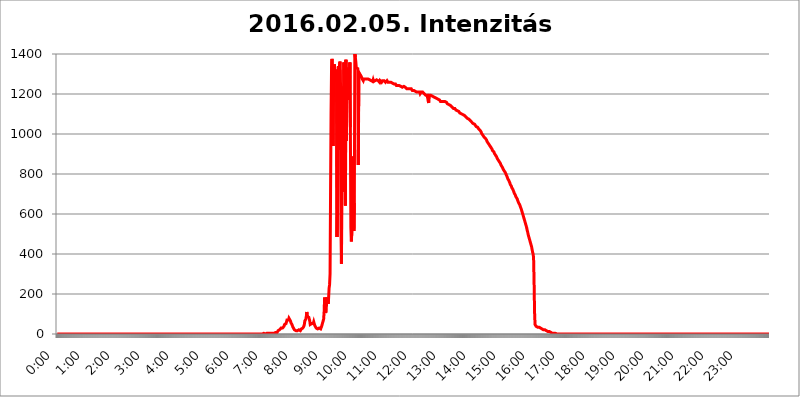
| Category | 2016.02.05. Intenzitás [W/m^2] |
|---|---|
| 0.0 | 0 |
| 0.0006944444444444445 | 0 |
| 0.001388888888888889 | 0 |
| 0.0020833333333333333 | 0 |
| 0.002777777777777778 | 0 |
| 0.003472222222222222 | 0 |
| 0.004166666666666667 | 0 |
| 0.004861111111111111 | 0 |
| 0.005555555555555556 | 0 |
| 0.0062499999999999995 | 0 |
| 0.006944444444444444 | 0 |
| 0.007638888888888889 | 0 |
| 0.008333333333333333 | 0 |
| 0.009027777777777779 | 0 |
| 0.009722222222222222 | 0 |
| 0.010416666666666666 | 0 |
| 0.011111111111111112 | 0 |
| 0.011805555555555555 | 0 |
| 0.012499999999999999 | 0 |
| 0.013194444444444444 | 0 |
| 0.013888888888888888 | 0 |
| 0.014583333333333332 | 0 |
| 0.015277777777777777 | 0 |
| 0.015972222222222224 | 0 |
| 0.016666666666666666 | 0 |
| 0.017361111111111112 | 0 |
| 0.018055555555555557 | 0 |
| 0.01875 | 0 |
| 0.019444444444444445 | 0 |
| 0.02013888888888889 | 0 |
| 0.020833333333333332 | 0 |
| 0.02152777777777778 | 0 |
| 0.022222222222222223 | 0 |
| 0.02291666666666667 | 0 |
| 0.02361111111111111 | 0 |
| 0.024305555555555556 | 0 |
| 0.024999999999999998 | 0 |
| 0.025694444444444447 | 0 |
| 0.02638888888888889 | 0 |
| 0.027083333333333334 | 0 |
| 0.027777777777777776 | 0 |
| 0.02847222222222222 | 0 |
| 0.029166666666666664 | 0 |
| 0.029861111111111113 | 0 |
| 0.030555555555555555 | 0 |
| 0.03125 | 0 |
| 0.03194444444444445 | 0 |
| 0.03263888888888889 | 0 |
| 0.03333333333333333 | 0 |
| 0.034027777777777775 | 0 |
| 0.034722222222222224 | 0 |
| 0.035416666666666666 | 0 |
| 0.036111111111111115 | 0 |
| 0.03680555555555556 | 0 |
| 0.0375 | 0 |
| 0.03819444444444444 | 0 |
| 0.03888888888888889 | 0 |
| 0.03958333333333333 | 0 |
| 0.04027777777777778 | 0 |
| 0.04097222222222222 | 0 |
| 0.041666666666666664 | 0 |
| 0.042361111111111106 | 0 |
| 0.04305555555555556 | 0 |
| 0.043750000000000004 | 0 |
| 0.044444444444444446 | 0 |
| 0.04513888888888889 | 0 |
| 0.04583333333333334 | 0 |
| 0.04652777777777778 | 0 |
| 0.04722222222222222 | 0 |
| 0.04791666666666666 | 0 |
| 0.04861111111111111 | 0 |
| 0.049305555555555554 | 0 |
| 0.049999999999999996 | 0 |
| 0.05069444444444445 | 0 |
| 0.051388888888888894 | 0 |
| 0.052083333333333336 | 0 |
| 0.05277777777777778 | 0 |
| 0.05347222222222222 | 0 |
| 0.05416666666666667 | 0 |
| 0.05486111111111111 | 0 |
| 0.05555555555555555 | 0 |
| 0.05625 | 0 |
| 0.05694444444444444 | 0 |
| 0.057638888888888885 | 0 |
| 0.05833333333333333 | 0 |
| 0.05902777777777778 | 0 |
| 0.059722222222222225 | 0 |
| 0.06041666666666667 | 0 |
| 0.061111111111111116 | 0 |
| 0.06180555555555556 | 0 |
| 0.0625 | 0 |
| 0.06319444444444444 | 0 |
| 0.06388888888888888 | 0 |
| 0.06458333333333334 | 0 |
| 0.06527777777777778 | 0 |
| 0.06597222222222222 | 0 |
| 0.06666666666666667 | 0 |
| 0.06736111111111111 | 0 |
| 0.06805555555555555 | 0 |
| 0.06874999999999999 | 0 |
| 0.06944444444444443 | 0 |
| 0.07013888888888889 | 0 |
| 0.07083333333333333 | 0 |
| 0.07152777777777779 | 0 |
| 0.07222222222222223 | 0 |
| 0.07291666666666667 | 0 |
| 0.07361111111111111 | 0 |
| 0.07430555555555556 | 0 |
| 0.075 | 0 |
| 0.07569444444444444 | 0 |
| 0.0763888888888889 | 0 |
| 0.07708333333333334 | 0 |
| 0.07777777777777778 | 0 |
| 0.07847222222222222 | 0 |
| 0.07916666666666666 | 0 |
| 0.0798611111111111 | 0 |
| 0.08055555555555556 | 0 |
| 0.08125 | 0 |
| 0.08194444444444444 | 0 |
| 0.08263888888888889 | 0 |
| 0.08333333333333333 | 0 |
| 0.08402777777777777 | 0 |
| 0.08472222222222221 | 0 |
| 0.08541666666666665 | 0 |
| 0.08611111111111112 | 0 |
| 0.08680555555555557 | 0 |
| 0.08750000000000001 | 0 |
| 0.08819444444444445 | 0 |
| 0.08888888888888889 | 0 |
| 0.08958333333333333 | 0 |
| 0.09027777777777778 | 0 |
| 0.09097222222222222 | 0 |
| 0.09166666666666667 | 0 |
| 0.09236111111111112 | 0 |
| 0.09305555555555556 | 0 |
| 0.09375 | 0 |
| 0.09444444444444444 | 0 |
| 0.09513888888888888 | 0 |
| 0.09583333333333333 | 0 |
| 0.09652777777777777 | 0 |
| 0.09722222222222222 | 0 |
| 0.09791666666666667 | 0 |
| 0.09861111111111111 | 0 |
| 0.09930555555555555 | 0 |
| 0.09999999999999999 | 0 |
| 0.10069444444444443 | 0 |
| 0.1013888888888889 | 0 |
| 0.10208333333333335 | 0 |
| 0.10277777777777779 | 0 |
| 0.10347222222222223 | 0 |
| 0.10416666666666667 | 0 |
| 0.10486111111111111 | 0 |
| 0.10555555555555556 | 0 |
| 0.10625 | 0 |
| 0.10694444444444444 | 0 |
| 0.1076388888888889 | 0 |
| 0.10833333333333334 | 0 |
| 0.10902777777777778 | 0 |
| 0.10972222222222222 | 0 |
| 0.1111111111111111 | 0 |
| 0.11180555555555556 | 0 |
| 0.11180555555555556 | 0 |
| 0.1125 | 0 |
| 0.11319444444444444 | 0 |
| 0.11388888888888889 | 0 |
| 0.11458333333333333 | 0 |
| 0.11527777777777777 | 0 |
| 0.11597222222222221 | 0 |
| 0.11666666666666665 | 0 |
| 0.1173611111111111 | 0 |
| 0.11805555555555557 | 0 |
| 0.11944444444444445 | 0 |
| 0.12013888888888889 | 0 |
| 0.12083333333333333 | 0 |
| 0.12152777777777778 | 0 |
| 0.12222222222222223 | 0 |
| 0.12291666666666667 | 0 |
| 0.12291666666666667 | 0 |
| 0.12361111111111112 | 0 |
| 0.12430555555555556 | 0 |
| 0.125 | 0 |
| 0.12569444444444444 | 0 |
| 0.12638888888888888 | 0 |
| 0.12708333333333333 | 0 |
| 0.16875 | 0 |
| 0.12847222222222224 | 0 |
| 0.12916666666666668 | 0 |
| 0.12986111111111112 | 0 |
| 0.13055555555555556 | 0 |
| 0.13125 | 0 |
| 0.13194444444444445 | 0 |
| 0.1326388888888889 | 0 |
| 0.13333333333333333 | 0 |
| 0.13402777777777777 | 0 |
| 0.13402777777777777 | 0 |
| 0.13472222222222222 | 0 |
| 0.13541666666666666 | 0 |
| 0.1361111111111111 | 0 |
| 0.13749999999999998 | 0 |
| 0.13819444444444443 | 0 |
| 0.1388888888888889 | 0 |
| 0.13958333333333334 | 0 |
| 0.14027777777777778 | 0 |
| 0.14097222222222222 | 0 |
| 0.14166666666666666 | 0 |
| 0.1423611111111111 | 0 |
| 0.14305555555555557 | 0 |
| 0.14375000000000002 | 0 |
| 0.14444444444444446 | 0 |
| 0.1451388888888889 | 0 |
| 0.1451388888888889 | 0 |
| 0.14652777777777778 | 0 |
| 0.14722222222222223 | 0 |
| 0.14791666666666667 | 0 |
| 0.1486111111111111 | 0 |
| 0.14930555555555555 | 0 |
| 0.15 | 0 |
| 0.15069444444444444 | 0 |
| 0.15138888888888888 | 0 |
| 0.15208333333333332 | 0 |
| 0.15277777777777776 | 0 |
| 0.15347222222222223 | 0 |
| 0.15416666666666667 | 0 |
| 0.15486111111111112 | 0 |
| 0.15555555555555556 | 0 |
| 0.15625 | 0 |
| 0.15694444444444444 | 0 |
| 0.15763888888888888 | 0 |
| 0.15833333333333333 | 0 |
| 0.15902777777777777 | 0 |
| 0.15972222222222224 | 0 |
| 0.16041666666666668 | 0 |
| 0.16111111111111112 | 0 |
| 0.16180555555555556 | 0 |
| 0.1625 | 0 |
| 0.16319444444444445 | 0 |
| 0.1638888888888889 | 0 |
| 0.16458333333333333 | 0 |
| 0.16527777777777777 | 0 |
| 0.16597222222222222 | 0 |
| 0.16666666666666666 | 0 |
| 0.1673611111111111 | 0 |
| 0.16805555555555554 | 0 |
| 0.16874999999999998 | 0 |
| 0.16944444444444443 | 0 |
| 0.17013888888888887 | 0 |
| 0.1708333333333333 | 0 |
| 0.17152777777777775 | 0 |
| 0.17222222222222225 | 0 |
| 0.1729166666666667 | 0 |
| 0.17361111111111113 | 0 |
| 0.17430555555555557 | 0 |
| 0.17500000000000002 | 0 |
| 0.17569444444444446 | 0 |
| 0.1763888888888889 | 0 |
| 0.17708333333333334 | 0 |
| 0.17777777777777778 | 0 |
| 0.17847222222222223 | 0 |
| 0.17916666666666667 | 0 |
| 0.1798611111111111 | 0 |
| 0.18055555555555555 | 0 |
| 0.18125 | 0 |
| 0.18194444444444444 | 0 |
| 0.1826388888888889 | 0 |
| 0.18333333333333335 | 0 |
| 0.1840277777777778 | 0 |
| 0.18472222222222223 | 0 |
| 0.18541666666666667 | 0 |
| 0.18611111111111112 | 0 |
| 0.18680555555555556 | 0 |
| 0.1875 | 0 |
| 0.18819444444444444 | 0 |
| 0.18888888888888888 | 0 |
| 0.18958333333333333 | 0 |
| 0.19027777777777777 | 0 |
| 0.1909722222222222 | 0 |
| 0.19166666666666665 | 0 |
| 0.19236111111111112 | 0 |
| 0.19305555555555554 | 0 |
| 0.19375 | 0 |
| 0.19444444444444445 | 0 |
| 0.1951388888888889 | 0 |
| 0.19583333333333333 | 0 |
| 0.19652777777777777 | 0 |
| 0.19722222222222222 | 0 |
| 0.19791666666666666 | 0 |
| 0.1986111111111111 | 0 |
| 0.19930555555555554 | 0 |
| 0.19999999999999998 | 0 |
| 0.20069444444444443 | 0 |
| 0.20138888888888887 | 0 |
| 0.2020833333333333 | 0 |
| 0.2027777777777778 | 0 |
| 0.2034722222222222 | 0 |
| 0.2041666666666667 | 0 |
| 0.20486111111111113 | 0 |
| 0.20555555555555557 | 0 |
| 0.20625000000000002 | 0 |
| 0.20694444444444446 | 0 |
| 0.2076388888888889 | 0 |
| 0.20833333333333334 | 0 |
| 0.20902777777777778 | 0 |
| 0.20972222222222223 | 0 |
| 0.21041666666666667 | 0 |
| 0.2111111111111111 | 0 |
| 0.21180555555555555 | 0 |
| 0.2125 | 0 |
| 0.21319444444444444 | 0 |
| 0.2138888888888889 | 0 |
| 0.21458333333333335 | 0 |
| 0.2152777777777778 | 0 |
| 0.21597222222222223 | 0 |
| 0.21666666666666667 | 0 |
| 0.21736111111111112 | 0 |
| 0.21805555555555556 | 0 |
| 0.21875 | 0 |
| 0.21944444444444444 | 0 |
| 0.22013888888888888 | 0 |
| 0.22083333333333333 | 0 |
| 0.22152777777777777 | 0 |
| 0.2222222222222222 | 0 |
| 0.22291666666666665 | 0 |
| 0.2236111111111111 | 0 |
| 0.22430555555555556 | 0 |
| 0.225 | 0 |
| 0.22569444444444445 | 0 |
| 0.2263888888888889 | 0 |
| 0.22708333333333333 | 0 |
| 0.22777777777777777 | 0 |
| 0.22847222222222222 | 0 |
| 0.22916666666666666 | 0 |
| 0.2298611111111111 | 0 |
| 0.23055555555555554 | 0 |
| 0.23124999999999998 | 0 |
| 0.23194444444444443 | 0 |
| 0.23263888888888887 | 0 |
| 0.2333333333333333 | 0 |
| 0.2340277777777778 | 0 |
| 0.2347222222222222 | 0 |
| 0.2354166666666667 | 0 |
| 0.23611111111111113 | 0 |
| 0.23680555555555557 | 0 |
| 0.23750000000000002 | 0 |
| 0.23819444444444446 | 0 |
| 0.2388888888888889 | 0 |
| 0.23958333333333334 | 0 |
| 0.24027777777777778 | 0 |
| 0.24097222222222223 | 0 |
| 0.24166666666666667 | 0 |
| 0.2423611111111111 | 0 |
| 0.24305555555555555 | 0 |
| 0.24375 | 0 |
| 0.24444444444444446 | 0 |
| 0.24513888888888888 | 0 |
| 0.24583333333333335 | 0 |
| 0.2465277777777778 | 0 |
| 0.24722222222222223 | 0 |
| 0.24791666666666667 | 0 |
| 0.24861111111111112 | 0 |
| 0.24930555555555556 | 0 |
| 0.25 | 0 |
| 0.25069444444444444 | 0 |
| 0.2513888888888889 | 0 |
| 0.2520833333333333 | 0 |
| 0.25277777777777777 | 0 |
| 0.2534722222222222 | 0 |
| 0.25416666666666665 | 0 |
| 0.2548611111111111 | 0 |
| 0.2555555555555556 | 0 |
| 0.25625000000000003 | 0 |
| 0.2569444444444445 | 0 |
| 0.2576388888888889 | 0 |
| 0.25833333333333336 | 0 |
| 0.2590277777777778 | 0 |
| 0.25972222222222224 | 0 |
| 0.2604166666666667 | 0 |
| 0.2611111111111111 | 0 |
| 0.26180555555555557 | 0 |
| 0.2625 | 0 |
| 0.26319444444444445 | 0 |
| 0.2638888888888889 | 0 |
| 0.26458333333333334 | 0 |
| 0.2652777777777778 | 0 |
| 0.2659722222222222 | 0 |
| 0.26666666666666666 | 0 |
| 0.2673611111111111 | 0 |
| 0.26805555555555555 | 0 |
| 0.26875 | 0 |
| 0.26944444444444443 | 0 |
| 0.2701388888888889 | 0 |
| 0.2708333333333333 | 0 |
| 0.27152777777777776 | 0 |
| 0.2722222222222222 | 0 |
| 0.27291666666666664 | 0 |
| 0.2736111111111111 | 0 |
| 0.2743055555555555 | 0 |
| 0.27499999999999997 | 0 |
| 0.27569444444444446 | 0 |
| 0.27638888888888885 | 0 |
| 0.27708333333333335 | 0 |
| 0.2777777777777778 | 0 |
| 0.27847222222222223 | 0 |
| 0.2791666666666667 | 0 |
| 0.2798611111111111 | 0 |
| 0.28055555555555556 | 0 |
| 0.28125 | 0 |
| 0.28194444444444444 | 0 |
| 0.2826388888888889 | 0 |
| 0.2833333333333333 | 0 |
| 0.28402777777777777 | 0 |
| 0.2847222222222222 | 0 |
| 0.28541666666666665 | 0 |
| 0.28611111111111115 | 0 |
| 0.28680555555555554 | 0 |
| 0.28750000000000003 | 0 |
| 0.2881944444444445 | 0 |
| 0.2888888888888889 | 3.525 |
| 0.28958333333333336 | 3.525 |
| 0.2902777777777778 | 3.525 |
| 0.29097222222222224 | 0 |
| 0.2916666666666667 | 0 |
| 0.2923611111111111 | 3.525 |
| 0.29305555555555557 | 3.525 |
| 0.29375 | 3.525 |
| 0.29444444444444445 | 0 |
| 0.2951388888888889 | 3.525 |
| 0.29583333333333334 | 3.525 |
| 0.2965277777777778 | 3.525 |
| 0.2972222222222222 | 3.525 |
| 0.29791666666666666 | 3.525 |
| 0.2986111111111111 | 3.525 |
| 0.29930555555555555 | 3.525 |
| 0.3 | 3.525 |
| 0.30069444444444443 | 3.525 |
| 0.3013888888888889 | 3.525 |
| 0.3020833333333333 | 3.525 |
| 0.30277777777777776 | 3.525 |
| 0.3034722222222222 | 3.525 |
| 0.30416666666666664 | 3.525 |
| 0.3048611111111111 | 7.887 |
| 0.3055555555555555 | 7.887 |
| 0.30624999999999997 | 7.887 |
| 0.3069444444444444 | 7.887 |
| 0.3076388888888889 | 12.257 |
| 0.30833333333333335 | 7.887 |
| 0.3090277777777778 | 12.257 |
| 0.30972222222222223 | 16.636 |
| 0.3104166666666667 | 16.636 |
| 0.3111111111111111 | 21.024 |
| 0.31180555555555556 | 21.024 |
| 0.3125 | 21.024 |
| 0.31319444444444444 | 25.419 |
| 0.3138888888888889 | 29.823 |
| 0.3145833333333333 | 25.419 |
| 0.31527777777777777 | 25.419 |
| 0.3159722222222222 | 29.823 |
| 0.31666666666666665 | 34.234 |
| 0.31736111111111115 | 34.234 |
| 0.31805555555555554 | 38.653 |
| 0.31875000000000003 | 47.511 |
| 0.3194444444444445 | 51.951 |
| 0.3201388888888889 | 51.951 |
| 0.32083333333333336 | 51.951 |
| 0.3215277777777778 | 60.85 |
| 0.32222222222222224 | 69.775 |
| 0.3229166666666667 | 69.775 |
| 0.3236111111111111 | 74.246 |
| 0.32430555555555557 | 69.775 |
| 0.325 | 78.722 |
| 0.32569444444444445 | 74.246 |
| 0.3263888888888889 | 83.205 |
| 0.32708333333333334 | 65.31 |
| 0.3277777777777778 | 56.398 |
| 0.3284722222222222 | 60.85 |
| 0.32916666666666666 | 47.511 |
| 0.3298611111111111 | 43.079 |
| 0.33055555555555555 | 34.234 |
| 0.33125 | 29.823 |
| 0.33194444444444443 | 29.823 |
| 0.3326388888888889 | 21.024 |
| 0.3333333333333333 | 21.024 |
| 0.3340277777777778 | 16.636 |
| 0.3347222222222222 | 16.636 |
| 0.3354166666666667 | 16.636 |
| 0.3361111111111111 | 16.636 |
| 0.3368055555555556 | 16.636 |
| 0.33749999999999997 | 12.257 |
| 0.33819444444444446 | 16.636 |
| 0.33888888888888885 | 21.024 |
| 0.33958333333333335 | 21.024 |
| 0.34027777777777773 | 16.636 |
| 0.34097222222222223 | 16.636 |
| 0.3416666666666666 | 21.024 |
| 0.3423611111111111 | 25.419 |
| 0.3430555555555555 | 25.419 |
| 0.34375 | 29.823 |
| 0.3444444444444445 | 29.823 |
| 0.3451388888888889 | 34.234 |
| 0.3458333333333334 | 38.653 |
| 0.34652777777777777 | 47.511 |
| 0.34722222222222227 | 65.31 |
| 0.34791666666666665 | 65.31 |
| 0.34861111111111115 | 74.246 |
| 0.34930555555555554 | 87.692 |
| 0.35000000000000003 | 110.201 |
| 0.3506944444444444 | 87.692 |
| 0.3513888888888889 | 87.692 |
| 0.3520833333333333 | 87.692 |
| 0.3527777777777778 | 83.205 |
| 0.3534722222222222 | 78.722 |
| 0.3541666666666667 | 65.31 |
| 0.3548611111111111 | 47.511 |
| 0.35555555555555557 | 47.511 |
| 0.35625 | 47.511 |
| 0.35694444444444445 | 51.951 |
| 0.3576388888888889 | 47.511 |
| 0.35833333333333334 | 47.511 |
| 0.3590277777777778 | 51.951 |
| 0.3597222222222222 | 60.85 |
| 0.36041666666666666 | 56.398 |
| 0.3611111111111111 | 43.079 |
| 0.36180555555555555 | 43.079 |
| 0.3625 | 38.653 |
| 0.36319444444444443 | 29.823 |
| 0.3638888888888889 | 29.823 |
| 0.3645833333333333 | 29.823 |
| 0.3652777777777778 | 25.419 |
| 0.3659722222222222 | 25.419 |
| 0.3666666666666667 | 29.823 |
| 0.3673611111111111 | 29.823 |
| 0.3680555555555556 | 29.823 |
| 0.36874999999999997 | 29.823 |
| 0.36944444444444446 | 25.419 |
| 0.37013888888888885 | 29.823 |
| 0.37083333333333335 | 38.653 |
| 0.37152777777777773 | 47.511 |
| 0.37222222222222223 | 56.398 |
| 0.3729166666666666 | 56.398 |
| 0.3736111111111111 | 74.246 |
| 0.3743055555555555 | 110.201 |
| 0.375 | 182.82 |
| 0.3756944444444445 | 150.964 |
| 0.3763888888888889 | 105.69 |
| 0.3770833333333334 | 114.716 |
| 0.37777777777777777 | 155.509 |
| 0.37847222222222227 | 173.709 |
| 0.37916666666666665 | 182.82 |
| 0.37986111111111115 | 150.964 |
| 0.38055555555555554 | 178.264 |
| 0.38125000000000003 | 228.436 |
| 0.3819444444444444 | 246.689 |
| 0.3826388888888889 | 301.354 |
| 0.3833333333333333 | 711.832 |
| 0.3840277777777778 | 1105.019 |
| 0.3847222222222222 | 1335.223 |
| 0.3854166666666667 | 1375.633 |
| 0.3861111111111111 | 1375.633 |
| 0.38680555555555557 | 940.082 |
| 0.3875 | 1217.812 |
| 0.38819444444444445 | 1339.639 |
| 0.3888888888888889 | 1348.524 |
| 0.38958333333333334 | 1291.997 |
| 0.3902777777777778 | 1322.082 |
| 0.3909722222222222 | 1258.511 |
| 0.39166666666666666 | 1313.406 |
| 0.3923611111111111 | 484.735 |
| 0.39305555555555555 | 617.436 |
| 0.39375 | 829.981 |
| 0.39444444444444443 | 1339.639 |
| 0.3951388888888889 | 921.298 |
| 0.3958333333333333 | 1339.639 |
| 0.3965277777777778 | 1361.991 |
| 0.3972222222222222 | 1233.951 |
| 0.3979166666666667 | 528.2 |
| 0.3986111111111111 | 351.198 |
| 0.3993055555555556 | 943.832 |
| 0.39999999999999997 | 1238.014 |
| 0.40069444444444446 | 1059.756 |
| 0.40138888888888885 | 711.832 |
| 0.40208333333333335 | 1357.483 |
| 0.40277777777777773 | 1071.027 |
| 0.40347222222222223 | 1262.649 |
| 0.4041666666666666 | 642.4 |
| 0.4048611111111111 | 1371.066 |
| 0.4055555555555555 | 966.295 |
| 0.40625 | 1330.826 |
| 0.4069444444444445 | 1335.223 |
| 0.4076388888888889 | 1283.541 |
| 0.4083333333333334 | 1330.826 |
| 0.40902777777777777 | 1300.514 |
| 0.40972222222222227 | 1170.358 |
| 0.41041666666666665 | 1357.483 |
| 0.41111111111111115 | 1033.537 |
| 0.41180555555555554 | 532.513 |
| 0.41250000000000003 | 462.786 |
| 0.4131944444444444 | 515.223 |
| 0.4138888888888889 | 523.88 |
| 0.4145833333333333 | 667.123 |
| 0.4152777777777778 | 887.309 |
| 0.4159722222222222 | 515.223 |
| 0.4166666666666667 | 654.791 |
| 0.4173611111111111 | 1408.184 |
| 0.41805555555555557 | 1384.828 |
| 0.41875 | 1361.991 |
| 0.41944444444444445 | 1330.826 |
| 0.4201388888888889 | 1330.826 |
| 0.42083333333333334 | 1335.223 |
| 0.4215277777777778 | 1326.445 |
| 0.4222222222222222 | 845.365 |
| 0.42291666666666666 | 1275.142 |
| 0.4236111111111111 | 1304.795 |
| 0.42430555555555555 | 1300.514 |
| 0.425 | 1296.248 |
| 0.42569444444444443 | 1291.997 |
| 0.4263888888888889 | 1287.761 |
| 0.4270833333333333 | 1287.761 |
| 0.4277777777777778 | 1275.142 |
| 0.4284722222222222 | 1279.334 |
| 0.4291666666666667 | 1266.8 |
| 0.4298611111111111 | 1275.142 |
| 0.4305555555555556 | 1275.142 |
| 0.43124999999999997 | 1270.964 |
| 0.43194444444444446 | 1275.142 |
| 0.43263888888888885 | 1270.964 |
| 0.43333333333333335 | 1270.964 |
| 0.43402777777777773 | 1275.142 |
| 0.43472222222222223 | 1275.142 |
| 0.4354166666666666 | 1275.142 |
| 0.4361111111111111 | 1275.142 |
| 0.4368055555555555 | 1275.142 |
| 0.4375 | 1275.142 |
| 0.4381944444444445 | 1270.964 |
| 0.4388888888888889 | 1266.8 |
| 0.4395833333333334 | 1266.8 |
| 0.44027777777777777 | 1266.8 |
| 0.44097222222222227 | 1266.8 |
| 0.44166666666666665 | 1266.8 |
| 0.44236111111111115 | 1262.649 |
| 0.44305555555555554 | 1270.964 |
| 0.44375000000000003 | 1262.649 |
| 0.4444444444444444 | 1266.8 |
| 0.4451388888888889 | 1266.8 |
| 0.4458333333333333 | 1266.8 |
| 0.4465277777777778 | 1266.8 |
| 0.4472222222222222 | 1266.8 |
| 0.4479166666666667 | 1270.964 |
| 0.4486111111111111 | 1266.8 |
| 0.44930555555555557 | 1266.8 |
| 0.45 | 1266.8 |
| 0.45069444444444445 | 1266.8 |
| 0.4513888888888889 | 1262.649 |
| 0.45208333333333334 | 1258.511 |
| 0.4527777777777778 | 1266.8 |
| 0.4534722222222222 | 1262.649 |
| 0.45416666666666666 | 1266.8 |
| 0.4548611111111111 | 1258.511 |
| 0.45555555555555555 | 1262.649 |
| 0.45625 | 1266.8 |
| 0.45694444444444443 | 1262.649 |
| 0.4576388888888889 | 1262.649 |
| 0.4583333333333333 | 1266.8 |
| 0.4590277777777778 | 1262.649 |
| 0.4597222222222222 | 1262.649 |
| 0.4604166666666667 | 1258.511 |
| 0.4611111111111111 | 1258.511 |
| 0.4618055555555556 | 1262.649 |
| 0.46249999999999997 | 1266.8 |
| 0.46319444444444446 | 1262.649 |
| 0.46388888888888885 | 1258.511 |
| 0.46458333333333335 | 1258.511 |
| 0.46527777777777773 | 1258.511 |
| 0.46597222222222223 | 1258.511 |
| 0.4666666666666666 | 1262.649 |
| 0.4673611111111111 | 1258.511 |
| 0.4680555555555555 | 1258.511 |
| 0.46875 | 1254.387 |
| 0.4694444444444445 | 1254.387 |
| 0.4701388888888889 | 1254.387 |
| 0.4708333333333334 | 1254.387 |
| 0.47152777777777777 | 1254.387 |
| 0.47222222222222227 | 1250.275 |
| 0.47291666666666665 | 1254.387 |
| 0.47361111111111115 | 1250.275 |
| 0.47430555555555554 | 1250.275 |
| 0.47500000000000003 | 1246.176 |
| 0.4756944444444444 | 1242.089 |
| 0.4763888888888889 | 1246.176 |
| 0.4770833333333333 | 1242.089 |
| 0.4777777777777778 | 1242.089 |
| 0.4784722222222222 | 1242.089 |
| 0.4791666666666667 | 1238.014 |
| 0.4798611111111111 | 1242.089 |
| 0.48055555555555557 | 1242.089 |
| 0.48125 | 1242.089 |
| 0.48194444444444445 | 1238.014 |
| 0.4826388888888889 | 1238.014 |
| 0.48333333333333334 | 1233.951 |
| 0.4840277777777778 | 1233.951 |
| 0.4847222222222222 | 1233.951 |
| 0.48541666666666666 | 1233.951 |
| 0.4861111111111111 | 1238.014 |
| 0.48680555555555555 | 1233.951 |
| 0.4875 | 1233.951 |
| 0.48819444444444443 | 1233.951 |
| 0.4888888888888889 | 1229.899 |
| 0.4895833333333333 | 1229.899 |
| 0.4902777777777778 | 1225.859 |
| 0.4909722222222222 | 1225.859 |
| 0.4916666666666667 | 1229.899 |
| 0.4923611111111111 | 1225.859 |
| 0.4930555555555556 | 1221.83 |
| 0.49374999999999997 | 1221.83 |
| 0.49444444444444446 | 1225.859 |
| 0.49513888888888885 | 1225.859 |
| 0.49583333333333335 | 1221.83 |
| 0.49652777777777773 | 1225.859 |
| 0.49722222222222223 | 1221.83 |
| 0.4979166666666666 | 1217.812 |
| 0.4986111111111111 | 1221.83 |
| 0.4993055555555555 | 1217.812 |
| 0.5 | 1217.812 |
| 0.5006944444444444 | 1217.812 |
| 0.5013888888888889 | 1217.812 |
| 0.5020833333333333 | 1213.804 |
| 0.5027777777777778 | 1209.807 |
| 0.5034722222222222 | 1209.807 |
| 0.5041666666666667 | 1209.807 |
| 0.5048611111111111 | 1209.807 |
| 0.5055555555555555 | 1209.807 |
| 0.50625 | 1209.807 |
| 0.5069444444444444 | 1209.807 |
| 0.5076388888888889 | 1209.807 |
| 0.5083333333333333 | 1209.807 |
| 0.5090277777777777 | 1201.843 |
| 0.5097222222222222 | 1205.82 |
| 0.5104166666666666 | 1209.807 |
| 0.5111111111111112 | 1213.804 |
| 0.5118055555555555 | 1209.807 |
| 0.5125000000000001 | 1209.807 |
| 0.5131944444444444 | 1205.82 |
| 0.513888888888889 | 1205.82 |
| 0.5145833333333333 | 1201.843 |
| 0.5152777777777778 | 1197.876 |
| 0.5159722222222222 | 1197.876 |
| 0.5166666666666667 | 1193.918 |
| 0.517361111111111 | 1193.918 |
| 0.5180555555555556 | 1197.876 |
| 0.5187499999999999 | 1193.918 |
| 0.5194444444444445 | 1197.876 |
| 0.5201388888888888 | 1193.918 |
| 0.5208333333333334 | 1154.814 |
| 0.5215277777777778 | 1193.918 |
| 0.5222222222222223 | 1193.918 |
| 0.5229166666666667 | 1193.918 |
| 0.5236111111111111 | 1193.918 |
| 0.5243055555555556 | 1193.918 |
| 0.525 | 1189.969 |
| 0.5256944444444445 | 1189.969 |
| 0.5263888888888889 | 1189.969 |
| 0.5270833333333333 | 1186.03 |
| 0.5277777777777778 | 1186.03 |
| 0.5284722222222222 | 1186.03 |
| 0.5291666666666667 | 1182.099 |
| 0.5298611111111111 | 1182.099 |
| 0.5305555555555556 | 1182.099 |
| 0.53125 | 1182.099 |
| 0.5319444444444444 | 1178.177 |
| 0.5326388888888889 | 1178.177 |
| 0.5333333333333333 | 1174.263 |
| 0.5340277777777778 | 1174.263 |
| 0.5347222222222222 | 1174.263 |
| 0.5354166666666667 | 1170.358 |
| 0.5361111111111111 | 1170.358 |
| 0.5368055555555555 | 1166.46 |
| 0.5375 | 1162.571 |
| 0.5381944444444444 | 1162.571 |
| 0.5388888888888889 | 1162.571 |
| 0.5395833333333333 | 1162.571 |
| 0.5402777777777777 | 1162.571 |
| 0.5409722222222222 | 1162.571 |
| 0.5416666666666666 | 1162.571 |
| 0.5423611111111112 | 1162.571 |
| 0.5430555555555555 | 1162.571 |
| 0.5437500000000001 | 1162.571 |
| 0.5444444444444444 | 1162.571 |
| 0.545138888888889 | 1158.689 |
| 0.5458333333333333 | 1158.689 |
| 0.5465277777777778 | 1154.814 |
| 0.5472222222222222 | 1150.946 |
| 0.5479166666666667 | 1150.946 |
| 0.548611111111111 | 1147.086 |
| 0.5493055555555556 | 1147.086 |
| 0.5499999999999999 | 1147.086 |
| 0.5506944444444445 | 1143.232 |
| 0.5513888888888888 | 1143.232 |
| 0.5520833333333334 | 1139.384 |
| 0.5527777777777778 | 1139.384 |
| 0.5534722222222223 | 1135.543 |
| 0.5541666666666667 | 1135.543 |
| 0.5548611111111111 | 1131.708 |
| 0.5555555555555556 | 1127.879 |
| 0.55625 | 1127.879 |
| 0.5569444444444445 | 1127.879 |
| 0.5576388888888889 | 1127.879 |
| 0.5583333333333333 | 1124.056 |
| 0.5590277777777778 | 1120.238 |
| 0.5597222222222222 | 1124.056 |
| 0.5604166666666667 | 1116.426 |
| 0.5611111111111111 | 1116.426 |
| 0.5618055555555556 | 1116.426 |
| 0.5625 | 1112.618 |
| 0.5631944444444444 | 1112.618 |
| 0.5638888888888889 | 1108.816 |
| 0.5645833333333333 | 1105.019 |
| 0.5652777777777778 | 1105.019 |
| 0.5659722222222222 | 1101.226 |
| 0.5666666666666667 | 1101.226 |
| 0.5673611111111111 | 1101.226 |
| 0.5680555555555555 | 1097.437 |
| 0.56875 | 1097.437 |
| 0.5694444444444444 | 1093.653 |
| 0.5701388888888889 | 1093.653 |
| 0.5708333333333333 | 1093.653 |
| 0.5715277777777777 | 1093.653 |
| 0.5722222222222222 | 1089.873 |
| 0.5729166666666666 | 1086.097 |
| 0.5736111111111112 | 1086.097 |
| 0.5743055555555555 | 1086.097 |
| 0.5750000000000001 | 1078.555 |
| 0.5756944444444444 | 1078.555 |
| 0.576388888888889 | 1074.789 |
| 0.5770833333333333 | 1074.789 |
| 0.5777777777777778 | 1071.027 |
| 0.5784722222222222 | 1071.027 |
| 0.5791666666666667 | 1067.267 |
| 0.579861111111111 | 1067.267 |
| 0.5805555555555556 | 1063.51 |
| 0.5812499999999999 | 1059.756 |
| 0.5819444444444445 | 1059.756 |
| 0.5826388888888888 | 1056.004 |
| 0.5833333333333334 | 1052.255 |
| 0.5840277777777778 | 1052.255 |
| 0.5847222222222223 | 1048.508 |
| 0.5854166666666667 | 1048.508 |
| 0.5861111111111111 | 1044.762 |
| 0.5868055555555556 | 1044.762 |
| 0.5875 | 1037.277 |
| 0.5881944444444445 | 1037.277 |
| 0.5888888888888889 | 1037.277 |
| 0.5895833333333333 | 1033.537 |
| 0.5902777777777778 | 1029.798 |
| 0.5909722222222222 | 1026.06 |
| 0.5916666666666667 | 1022.323 |
| 0.5923611111111111 | 1022.323 |
| 0.5930555555555556 | 1018.587 |
| 0.59375 | 1014.852 |
| 0.5944444444444444 | 1011.118 |
| 0.5951388888888889 | 1003.65 |
| 0.5958333333333333 | 999.916 |
| 0.5965277777777778 | 996.182 |
| 0.5972222222222222 | 992.448 |
| 0.5979166666666667 | 992.448 |
| 0.5986111111111111 | 984.98 |
| 0.5993055555555555 | 984.98 |
| 0.6 | 981.244 |
| 0.6006944444444444 | 977.508 |
| 0.6013888888888889 | 973.772 |
| 0.6020833333333333 | 970.034 |
| 0.6027777777777777 | 962.555 |
| 0.6034722222222222 | 958.814 |
| 0.6041666666666666 | 955.071 |
| 0.6048611111111112 | 951.327 |
| 0.6055555555555555 | 947.58 |
| 0.6062500000000001 | 943.832 |
| 0.6069444444444444 | 940.082 |
| 0.607638888888889 | 940.082 |
| 0.6083333333333333 | 932.576 |
| 0.6090277777777778 | 928.819 |
| 0.6097222222222222 | 925.06 |
| 0.6104166666666667 | 917.534 |
| 0.611111111111111 | 917.534 |
| 0.6118055555555556 | 913.766 |
| 0.6124999999999999 | 909.996 |
| 0.6131944444444445 | 902.447 |
| 0.6138888888888888 | 898.668 |
| 0.6145833333333334 | 894.885 |
| 0.6152777777777778 | 891.099 |
| 0.6159722222222223 | 887.309 |
| 0.6166666666666667 | 883.516 |
| 0.6173611111111111 | 875.918 |
| 0.6180555555555556 | 872.114 |
| 0.61875 | 868.305 |
| 0.6194444444444445 | 864.493 |
| 0.6201388888888889 | 860.676 |
| 0.6208333333333333 | 856.855 |
| 0.6215277777777778 | 853.029 |
| 0.6222222222222222 | 845.365 |
| 0.6229166666666667 | 845.365 |
| 0.6236111111111111 | 841.526 |
| 0.6243055555555556 | 833.834 |
| 0.625 | 833.834 |
| 0.6256944444444444 | 822.26 |
| 0.6263888888888889 | 822.26 |
| 0.6270833333333333 | 814.519 |
| 0.6277777777777778 | 810.641 |
| 0.6284722222222222 | 806.757 |
| 0.6291666666666667 | 802.868 |
| 0.6298611111111111 | 795.074 |
| 0.6305555555555555 | 791.169 |
| 0.63125 | 783.342 |
| 0.6319444444444444 | 775.492 |
| 0.6326388888888889 | 775.492 |
| 0.6333333333333333 | 767.62 |
| 0.6340277777777777 | 763.674 |
| 0.6347222222222222 | 755.766 |
| 0.6354166666666666 | 747.834 |
| 0.6361111111111112 | 743.859 |
| 0.6368055555555555 | 739.877 |
| 0.6375000000000001 | 731.896 |
| 0.6381944444444444 | 727.896 |
| 0.638888888888889 | 723.889 |
| 0.6395833333333333 | 719.877 |
| 0.6402777777777778 | 711.832 |
| 0.6409722222222222 | 703.762 |
| 0.6416666666666667 | 699.717 |
| 0.642361111111111 | 695.666 |
| 0.6430555555555556 | 687.544 |
| 0.6437499999999999 | 687.544 |
| 0.6444444444444445 | 683.473 |
| 0.6451388888888888 | 675.311 |
| 0.6458333333333334 | 667.123 |
| 0.6465277777777778 | 663.019 |
| 0.6472222222222223 | 654.791 |
| 0.6479166666666667 | 650.667 |
| 0.6486111111111111 | 646.537 |
| 0.6493055555555556 | 638.256 |
| 0.65 | 634.105 |
| 0.6506944444444445 | 625.784 |
| 0.6513888888888889 | 617.436 |
| 0.6520833333333333 | 613.252 |
| 0.6527777777777778 | 600.661 |
| 0.6534722222222222 | 592.233 |
| 0.6541666666666667 | 583.779 |
| 0.6548611111111111 | 575.299 |
| 0.6555555555555556 | 566.793 |
| 0.65625 | 558.261 |
| 0.6569444444444444 | 549.704 |
| 0.6576388888888889 | 541.121 |
| 0.6583333333333333 | 532.513 |
| 0.6590277777777778 | 519.555 |
| 0.6597222222222222 | 510.885 |
| 0.6604166666666667 | 497.836 |
| 0.6611111111111111 | 489.108 |
| 0.6618055555555555 | 480.356 |
| 0.6625 | 471.582 |
| 0.6631944444444444 | 462.786 |
| 0.6638888888888889 | 453.968 |
| 0.6645833333333333 | 445.129 |
| 0.6652777777777777 | 436.27 |
| 0.6659722222222222 | 422.943 |
| 0.6666666666666666 | 409.574 |
| 0.6673611111111111 | 400.638 |
| 0.6680555555555556 | 382.715 |
| 0.6687500000000001 | 264.932 |
| 0.6694444444444444 | 110.201 |
| 0.6701388888888888 | 47.511 |
| 0.6708333333333334 | 43.079 |
| 0.6715277777777778 | 38.653 |
| 0.6722222222222222 | 38.653 |
| 0.6729166666666666 | 38.653 |
| 0.6736111111111112 | 34.234 |
| 0.6743055555555556 | 38.653 |
| 0.6749999999999999 | 34.234 |
| 0.6756944444444444 | 34.234 |
| 0.6763888888888889 | 34.234 |
| 0.6770833333333334 | 29.823 |
| 0.6777777777777777 | 29.823 |
| 0.6784722222222223 | 29.823 |
| 0.6791666666666667 | 25.419 |
| 0.6798611111111111 | 25.419 |
| 0.6805555555555555 | 21.024 |
| 0.68125 | 21.024 |
| 0.6819444444444445 | 21.024 |
| 0.6826388888888889 | 21.024 |
| 0.6833333333333332 | 21.024 |
| 0.6840277777777778 | 21.024 |
| 0.6847222222222222 | 21.024 |
| 0.6854166666666667 | 16.636 |
| 0.686111111111111 | 16.636 |
| 0.6868055555555556 | 16.636 |
| 0.6875 | 16.636 |
| 0.6881944444444444 | 12.257 |
| 0.688888888888889 | 12.257 |
| 0.6895833333333333 | 12.257 |
| 0.6902777777777778 | 12.257 |
| 0.6909722222222222 | 7.887 |
| 0.6916666666666668 | 7.887 |
| 0.6923611111111111 | 7.887 |
| 0.6930555555555555 | 7.887 |
| 0.69375 | 7.887 |
| 0.6944444444444445 | 3.525 |
| 0.6951388888888889 | 3.525 |
| 0.6958333333333333 | 3.525 |
| 0.6965277777777777 | 3.525 |
| 0.6972222222222223 | 3.525 |
| 0.6979166666666666 | 3.525 |
| 0.6986111111111111 | 3.525 |
| 0.6993055555555556 | 0 |
| 0.7000000000000001 | 0 |
| 0.7006944444444444 | 0 |
| 0.7013888888888888 | 0 |
| 0.7020833333333334 | 0 |
| 0.7027777777777778 | 0 |
| 0.7034722222222222 | 0 |
| 0.7041666666666666 | 0 |
| 0.7048611111111112 | 0 |
| 0.7055555555555556 | 0 |
| 0.7062499999999999 | 0 |
| 0.7069444444444444 | 0 |
| 0.7076388888888889 | 0 |
| 0.7083333333333334 | 0 |
| 0.7090277777777777 | 0 |
| 0.7097222222222223 | 0 |
| 0.7104166666666667 | 0 |
| 0.7111111111111111 | 0 |
| 0.7118055555555555 | 0 |
| 0.7125 | 0 |
| 0.7131944444444445 | 0 |
| 0.7138888888888889 | 0 |
| 0.7145833333333332 | 0 |
| 0.7152777777777778 | 0 |
| 0.7159722222222222 | 0 |
| 0.7166666666666667 | 0 |
| 0.717361111111111 | 0 |
| 0.7180555555555556 | 0 |
| 0.71875 | 0 |
| 0.7194444444444444 | 0 |
| 0.720138888888889 | 0 |
| 0.7208333333333333 | 0 |
| 0.7215277777777778 | 0 |
| 0.7222222222222222 | 0 |
| 0.7229166666666668 | 0 |
| 0.7236111111111111 | 0 |
| 0.7243055555555555 | 0 |
| 0.725 | 0 |
| 0.7256944444444445 | 0 |
| 0.7263888888888889 | 0 |
| 0.7270833333333333 | 0 |
| 0.7277777777777777 | 0 |
| 0.7284722222222223 | 0 |
| 0.7291666666666666 | 0 |
| 0.7298611111111111 | 0 |
| 0.7305555555555556 | 0 |
| 0.7312500000000001 | 0 |
| 0.7319444444444444 | 0 |
| 0.7326388888888888 | 0 |
| 0.7333333333333334 | 0 |
| 0.7340277777777778 | 0 |
| 0.7347222222222222 | 0 |
| 0.7354166666666666 | 0 |
| 0.7361111111111112 | 0 |
| 0.7368055555555556 | 0 |
| 0.7374999999999999 | 0 |
| 0.7381944444444444 | 0 |
| 0.7388888888888889 | 0 |
| 0.7395833333333334 | 0 |
| 0.7402777777777777 | 0 |
| 0.7409722222222223 | 0 |
| 0.7416666666666667 | 0 |
| 0.7423611111111111 | 0 |
| 0.7430555555555555 | 0 |
| 0.74375 | 0 |
| 0.7444444444444445 | 0 |
| 0.7451388888888889 | 0 |
| 0.7458333333333332 | 0 |
| 0.7465277777777778 | 0 |
| 0.7472222222222222 | 0 |
| 0.7479166666666667 | 0 |
| 0.748611111111111 | 0 |
| 0.7493055555555556 | 0 |
| 0.75 | 0 |
| 0.7506944444444444 | 0 |
| 0.751388888888889 | 0 |
| 0.7520833333333333 | 0 |
| 0.7527777777777778 | 0 |
| 0.7534722222222222 | 0 |
| 0.7541666666666668 | 0 |
| 0.7548611111111111 | 0 |
| 0.7555555555555555 | 0 |
| 0.75625 | 0 |
| 0.7569444444444445 | 0 |
| 0.7576388888888889 | 0 |
| 0.7583333333333333 | 0 |
| 0.7590277777777777 | 0 |
| 0.7597222222222223 | 0 |
| 0.7604166666666666 | 0 |
| 0.7611111111111111 | 0 |
| 0.7618055555555556 | 0 |
| 0.7625000000000001 | 0 |
| 0.7631944444444444 | 0 |
| 0.7638888888888888 | 0 |
| 0.7645833333333334 | 0 |
| 0.7652777777777778 | 0 |
| 0.7659722222222222 | 0 |
| 0.7666666666666666 | 0 |
| 0.7673611111111112 | 0 |
| 0.7680555555555556 | 0 |
| 0.7687499999999999 | 0 |
| 0.7694444444444444 | 0 |
| 0.7701388888888889 | 0 |
| 0.7708333333333334 | 0 |
| 0.7715277777777777 | 0 |
| 0.7722222222222223 | 0 |
| 0.7729166666666667 | 0 |
| 0.7736111111111111 | 0 |
| 0.7743055555555555 | 0 |
| 0.775 | 0 |
| 0.7756944444444445 | 0 |
| 0.7763888888888889 | 0 |
| 0.7770833333333332 | 0 |
| 0.7777777777777778 | 0 |
| 0.7784722222222222 | 0 |
| 0.7791666666666667 | 0 |
| 0.779861111111111 | 0 |
| 0.7805555555555556 | 0 |
| 0.78125 | 0 |
| 0.7819444444444444 | 0 |
| 0.782638888888889 | 0 |
| 0.7833333333333333 | 0 |
| 0.7840277777777778 | 0 |
| 0.7847222222222222 | 0 |
| 0.7854166666666668 | 0 |
| 0.7861111111111111 | 0 |
| 0.7868055555555555 | 0 |
| 0.7875 | 0 |
| 0.7881944444444445 | 0 |
| 0.7888888888888889 | 0 |
| 0.7895833333333333 | 0 |
| 0.7902777777777777 | 0 |
| 0.7909722222222223 | 0 |
| 0.7916666666666666 | 0 |
| 0.7923611111111111 | 0 |
| 0.7930555555555556 | 0 |
| 0.7937500000000001 | 0 |
| 0.7944444444444444 | 0 |
| 0.7951388888888888 | 0 |
| 0.7958333333333334 | 0 |
| 0.7965277777777778 | 0 |
| 0.7972222222222222 | 0 |
| 0.7979166666666666 | 0 |
| 0.7986111111111112 | 0 |
| 0.7993055555555556 | 0 |
| 0.7999999999999999 | 0 |
| 0.8006944444444444 | 0 |
| 0.8013888888888889 | 0 |
| 0.8020833333333334 | 0 |
| 0.8027777777777777 | 0 |
| 0.8034722222222223 | 0 |
| 0.8041666666666667 | 0 |
| 0.8048611111111111 | 0 |
| 0.8055555555555555 | 0 |
| 0.80625 | 0 |
| 0.8069444444444445 | 0 |
| 0.8076388888888889 | 0 |
| 0.8083333333333332 | 0 |
| 0.8090277777777778 | 0 |
| 0.8097222222222222 | 0 |
| 0.8104166666666667 | 0 |
| 0.811111111111111 | 0 |
| 0.8118055555555556 | 0 |
| 0.8125 | 0 |
| 0.8131944444444444 | 0 |
| 0.813888888888889 | 0 |
| 0.8145833333333333 | 0 |
| 0.8152777777777778 | 0 |
| 0.8159722222222222 | 0 |
| 0.8166666666666668 | 0 |
| 0.8173611111111111 | 0 |
| 0.8180555555555555 | 0 |
| 0.81875 | 0 |
| 0.8194444444444445 | 0 |
| 0.8201388888888889 | 0 |
| 0.8208333333333333 | 0 |
| 0.8215277777777777 | 0 |
| 0.8222222222222223 | 0 |
| 0.8229166666666666 | 0 |
| 0.8236111111111111 | 0 |
| 0.8243055555555556 | 0 |
| 0.8250000000000001 | 0 |
| 0.8256944444444444 | 0 |
| 0.8263888888888888 | 0 |
| 0.8270833333333334 | 0 |
| 0.8277777777777778 | 0 |
| 0.8284722222222222 | 0 |
| 0.8291666666666666 | 0 |
| 0.8298611111111112 | 0 |
| 0.8305555555555556 | 0 |
| 0.8312499999999999 | 0 |
| 0.8319444444444444 | 0 |
| 0.8326388888888889 | 0 |
| 0.8333333333333334 | 0 |
| 0.8340277777777777 | 0 |
| 0.8347222222222223 | 0 |
| 0.8354166666666667 | 0 |
| 0.8361111111111111 | 0 |
| 0.8368055555555555 | 0 |
| 0.8375 | 0 |
| 0.8381944444444445 | 0 |
| 0.8388888888888889 | 0 |
| 0.8395833333333332 | 0 |
| 0.8402777777777778 | 0 |
| 0.8409722222222222 | 0 |
| 0.8416666666666667 | 0 |
| 0.842361111111111 | 0 |
| 0.8430555555555556 | 0 |
| 0.84375 | 0 |
| 0.8444444444444444 | 0 |
| 0.845138888888889 | 0 |
| 0.8458333333333333 | 0 |
| 0.8465277777777778 | 0 |
| 0.8472222222222222 | 0 |
| 0.8479166666666668 | 0 |
| 0.8486111111111111 | 0 |
| 0.8493055555555555 | 0 |
| 0.85 | 0 |
| 0.8506944444444445 | 0 |
| 0.8513888888888889 | 0 |
| 0.8520833333333333 | 0 |
| 0.8527777777777777 | 0 |
| 0.8534722222222223 | 0 |
| 0.8541666666666666 | 0 |
| 0.8548611111111111 | 0 |
| 0.8555555555555556 | 0 |
| 0.8562500000000001 | 0 |
| 0.8569444444444444 | 0 |
| 0.8576388888888888 | 0 |
| 0.8583333333333334 | 0 |
| 0.8590277777777778 | 0 |
| 0.8597222222222222 | 0 |
| 0.8604166666666666 | 0 |
| 0.8611111111111112 | 0 |
| 0.8618055555555556 | 0 |
| 0.8624999999999999 | 0 |
| 0.8631944444444444 | 0 |
| 0.8638888888888889 | 0 |
| 0.8645833333333334 | 0 |
| 0.8652777777777777 | 0 |
| 0.8659722222222223 | 0 |
| 0.8666666666666667 | 0 |
| 0.8673611111111111 | 0 |
| 0.8680555555555555 | 0 |
| 0.86875 | 0 |
| 0.8694444444444445 | 0 |
| 0.8701388888888889 | 0 |
| 0.8708333333333332 | 0 |
| 0.8715277777777778 | 0 |
| 0.8722222222222222 | 0 |
| 0.8729166666666667 | 0 |
| 0.873611111111111 | 0 |
| 0.8743055555555556 | 0 |
| 0.875 | 0 |
| 0.8756944444444444 | 0 |
| 0.876388888888889 | 0 |
| 0.8770833333333333 | 0 |
| 0.8777777777777778 | 0 |
| 0.8784722222222222 | 0 |
| 0.8791666666666668 | 0 |
| 0.8798611111111111 | 0 |
| 0.8805555555555555 | 0 |
| 0.88125 | 0 |
| 0.8819444444444445 | 0 |
| 0.8826388888888889 | 0 |
| 0.8833333333333333 | 0 |
| 0.8840277777777777 | 0 |
| 0.8847222222222223 | 0 |
| 0.8854166666666666 | 0 |
| 0.8861111111111111 | 0 |
| 0.8868055555555556 | 0 |
| 0.8875000000000001 | 0 |
| 0.8881944444444444 | 0 |
| 0.8888888888888888 | 0 |
| 0.8895833333333334 | 0 |
| 0.8902777777777778 | 0 |
| 0.8909722222222222 | 0 |
| 0.8916666666666666 | 0 |
| 0.8923611111111112 | 0 |
| 0.8930555555555556 | 0 |
| 0.8937499999999999 | 0 |
| 0.8944444444444444 | 0 |
| 0.8951388888888889 | 0 |
| 0.8958333333333334 | 0 |
| 0.8965277777777777 | 0 |
| 0.8972222222222223 | 0 |
| 0.8979166666666667 | 0 |
| 0.8986111111111111 | 0 |
| 0.8993055555555555 | 0 |
| 0.9 | 0 |
| 0.9006944444444445 | 0 |
| 0.9013888888888889 | 0 |
| 0.9020833333333332 | 0 |
| 0.9027777777777778 | 0 |
| 0.9034722222222222 | 0 |
| 0.9041666666666667 | 0 |
| 0.904861111111111 | 0 |
| 0.9055555555555556 | 0 |
| 0.90625 | 0 |
| 0.9069444444444444 | 0 |
| 0.907638888888889 | 0 |
| 0.9083333333333333 | 0 |
| 0.9090277777777778 | 0 |
| 0.9097222222222222 | 0 |
| 0.9104166666666668 | 0 |
| 0.9111111111111111 | 0 |
| 0.9118055555555555 | 0 |
| 0.9125 | 0 |
| 0.9131944444444445 | 0 |
| 0.9138888888888889 | 0 |
| 0.9145833333333333 | 0 |
| 0.9152777777777777 | 0 |
| 0.9159722222222223 | 0 |
| 0.9166666666666666 | 0 |
| 0.9173611111111111 | 0 |
| 0.9180555555555556 | 0 |
| 0.9187500000000001 | 0 |
| 0.9194444444444444 | 0 |
| 0.9201388888888888 | 0 |
| 0.9208333333333334 | 0 |
| 0.9215277777777778 | 0 |
| 0.9222222222222222 | 0 |
| 0.9229166666666666 | 0 |
| 0.9236111111111112 | 0 |
| 0.9243055555555556 | 0 |
| 0.9249999999999999 | 0 |
| 0.9256944444444444 | 0 |
| 0.9263888888888889 | 0 |
| 0.9270833333333334 | 0 |
| 0.9277777777777777 | 0 |
| 0.9284722222222223 | 0 |
| 0.9291666666666667 | 0 |
| 0.9298611111111111 | 0 |
| 0.9305555555555555 | 0 |
| 0.93125 | 0 |
| 0.9319444444444445 | 0 |
| 0.9326388888888889 | 0 |
| 0.9333333333333332 | 0 |
| 0.9340277777777778 | 0 |
| 0.9347222222222222 | 0 |
| 0.9354166666666667 | 0 |
| 0.936111111111111 | 0 |
| 0.9368055555555556 | 0 |
| 0.9375 | 0 |
| 0.9381944444444444 | 0 |
| 0.938888888888889 | 0 |
| 0.9395833333333333 | 0 |
| 0.9402777777777778 | 0 |
| 0.9409722222222222 | 0 |
| 0.9416666666666668 | 0 |
| 0.9423611111111111 | 0 |
| 0.9430555555555555 | 0 |
| 0.94375 | 0 |
| 0.9444444444444445 | 0 |
| 0.9451388888888889 | 0 |
| 0.9458333333333333 | 0 |
| 0.9465277777777777 | 0 |
| 0.9472222222222223 | 0 |
| 0.9479166666666666 | 0 |
| 0.9486111111111111 | 0 |
| 0.9493055555555556 | 0 |
| 0.9500000000000001 | 0 |
| 0.9506944444444444 | 0 |
| 0.9513888888888888 | 0 |
| 0.9520833333333334 | 0 |
| 0.9527777777777778 | 0 |
| 0.9534722222222222 | 0 |
| 0.9541666666666666 | 0 |
| 0.9548611111111112 | 0 |
| 0.9555555555555556 | 0 |
| 0.9562499999999999 | 0 |
| 0.9569444444444444 | 0 |
| 0.9576388888888889 | 0 |
| 0.9583333333333334 | 0 |
| 0.9590277777777777 | 0 |
| 0.9597222222222223 | 0 |
| 0.9604166666666667 | 0 |
| 0.9611111111111111 | 0 |
| 0.9618055555555555 | 0 |
| 0.9625 | 0 |
| 0.9631944444444445 | 0 |
| 0.9638888888888889 | 0 |
| 0.9645833333333332 | 0 |
| 0.9652777777777778 | 0 |
| 0.9659722222222222 | 0 |
| 0.9666666666666667 | 0 |
| 0.967361111111111 | 0 |
| 0.9680555555555556 | 0 |
| 0.96875 | 0 |
| 0.9694444444444444 | 0 |
| 0.970138888888889 | 0 |
| 0.9708333333333333 | 0 |
| 0.9715277777777778 | 0 |
| 0.9722222222222222 | 0 |
| 0.9729166666666668 | 0 |
| 0.9736111111111111 | 0 |
| 0.9743055555555555 | 0 |
| 0.975 | 0 |
| 0.9756944444444445 | 0 |
| 0.9763888888888889 | 0 |
| 0.9770833333333333 | 0 |
| 0.9777777777777777 | 0 |
| 0.9784722222222223 | 0 |
| 0.9791666666666666 | 0 |
| 0.9798611111111111 | 0 |
| 0.9805555555555556 | 0 |
| 0.9812500000000001 | 0 |
| 0.9819444444444444 | 0 |
| 0.9826388888888888 | 0 |
| 0.9833333333333334 | 0 |
| 0.9840277777777778 | 0 |
| 0.9847222222222222 | 0 |
| 0.9854166666666666 | 0 |
| 0.9861111111111112 | 0 |
| 0.9868055555555556 | 0 |
| 0.9874999999999999 | 0 |
| 0.9881944444444444 | 0 |
| 0.9888888888888889 | 0 |
| 0.9895833333333334 | 0 |
| 0.9902777777777777 | 0 |
| 0.9909722222222223 | 0 |
| 0.9916666666666667 | 0 |
| 0.9923611111111111 | 0 |
| 0.9930555555555555 | 0 |
| 0.99375 | 0 |
| 0.9944444444444445 | 0 |
| 0.9951388888888889 | 0 |
| 0.9958333333333332 | 0 |
| 0.9965277777777778 | 0 |
| 0.9972222222222222 | 0 |
| 0.9979166666666667 | 0 |
| 0.998611111111111 | 0 |
| 0.9993055555555556 | 0 |